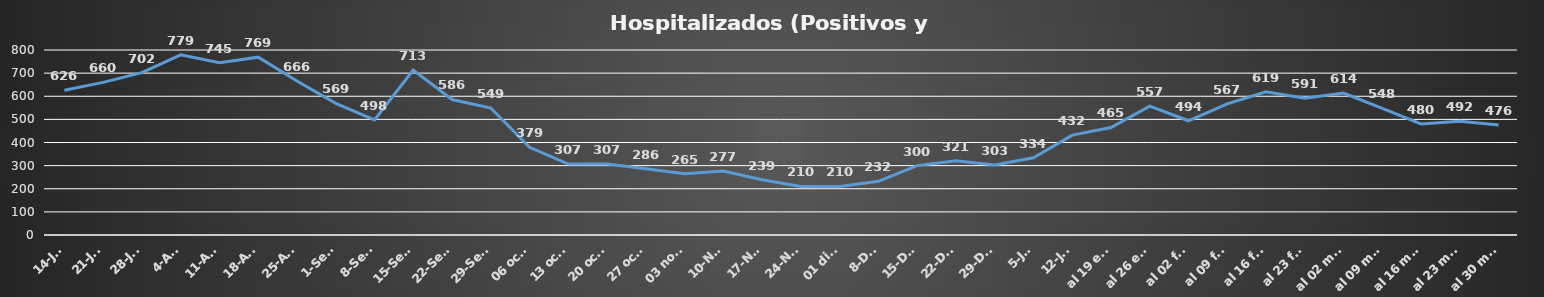
| Category | Series 0 |
|---|---|
| 14-Jul | 626 |
| 21-Jul | 660 |
| 28-Jul | 702 |
| 4-Ago | 779 |
| 11-Ago | 745 |
| 18-Ago | 769 |
| 25-Ago | 666 |
| 1-Set | 569 |
| 8-Set | 498 |
| 15-Set | 713 |
| 22-Set | 586 |
| 29-Set | 549 |
| 06 oct. | 379 |
| 13 oct. | 307 |
| 20 oct. | 307 |
| 27 oct. | 286 |
| 03 nov. | 265 |
| 10-Nov | 277 |
| 17-Nov | 239 |
| 24-Nov | 210 |
|  01 dic. | 210 |
| 8-Dic | 232 |
| 15-Dic | 300 |
| 22-Dic | 321 |
| 29-Dic | 303 |
| 5-Ene | 334 |
| 12-Ene | 432 |
| al 19 ene | 465 |
| al 26 ene | 557 |
| al 02 feb | 494 |
| al 09 feb | 567 |
| al 16 feb | 619 |
| al 23 feb | 591 |
| al 02 mar | 614 |
| al 09 mar | 548 |
| al 16 mar | 480 |
| al 23 mar | 492 |
| al 30 mar | 476 |